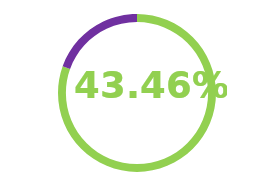
| Category | Series 0 |
|---|---|
| Índice atual | 0.435 |
| Diferença até o limite máximo | 0.105 |
| Extrapolou o limite máximo | 0 |